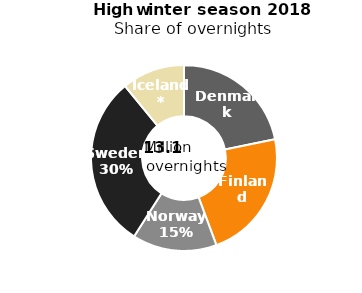
| Category | High winter 2018 |
|---|---|
| Denmark | 2848148 |
| Finland | 2950063 |
| Norway | 1921525 |
| Sweden | 3929031 |
| Iceland* | 1428954 |